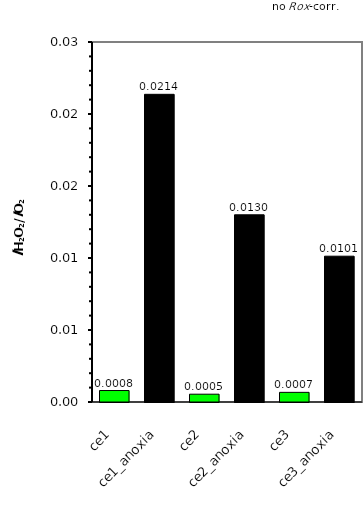
| Category | ce1 |
|---|---|
| ce1 | 0.001 |
| ce1_anoxia | 0.021 |
| ce2 | 0.001 |
| ce2_anoxia | 0.013 |
| ce3 | 0.001 |
| ce3_anoxia | 0.01 |